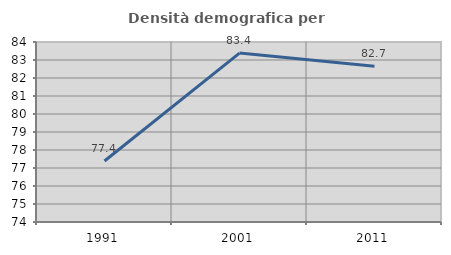
| Category | Densità demografica |
|---|---|
| 1991.0 | 77.39 |
| 2001.0 | 83.385 |
| 2011.0 | 82.658 |